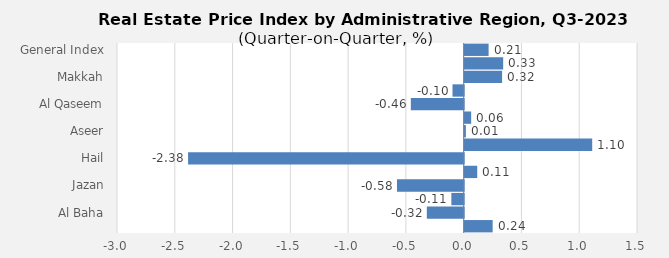
| Category | 2023 |
|---|---|
| General Index | 0.207 |
| Riyadh | 0.333 |
| Makkah | 0.324 |
| Madinah | -0.097 |
| Al Qaseem | -0.457 |
| Eastern Province | 0.056 |
| Aseer | 0.01 |
| Tabouk | 1.104 |
| Hail | -2.385 |
| Northern Borders | 0.109 |
| Jazan | -0.577 |
| Najran | -0.107 |
| Al Baha | -0.319 |
| Al Jouf | 0.242 |